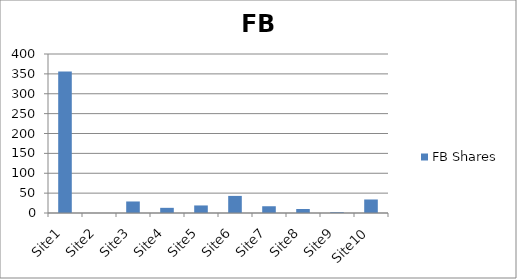
| Category | FB Shares |
|---|---|
| Site1 | 356 |
| Site2 | 0 |
| Site3 | 29 |
| Site4 | 13 |
| Site5 | 19 |
| Site6 | 43 |
| Site7 | 17 |
| Site8 | 10 |
| Site9 | 2 |
| Site10 | 34 |